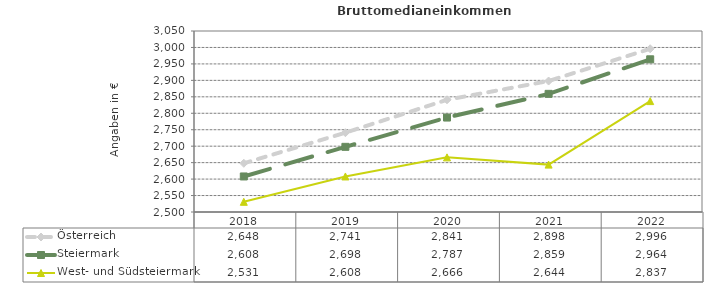
| Category | Österreich | Steiermark | West- und Südsteiermark |
|---|---|---|---|
| 2022.0 | 2996 | 2964 | 2837 |
| 2021.0 | 2898 | 2859 | 2644 |
| 2020.0 | 2841 | 2787 | 2666 |
| 2019.0 | 2741 | 2698 | 2608 |
| 2018.0 | 2648 | 2608 | 2531 |